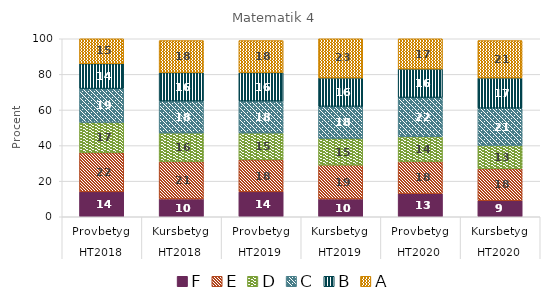
| Category | F | E | D | C | B | A |
|---|---|---|---|---|---|---|
| 0 | 14 | 22 | 17 | 19 | 14 | 15 |
| 1 | 10 | 21 | 16 | 18 | 16 | 18 |
| 2 | 14 | 18 | 15 | 18 | 16 | 18 |
| 3 | 10 | 19 | 15 | 18 | 16 | 23 |
| 4 | 13 | 18 | 14 | 22 | 16 | 17 |
| 5 | 9 | 18 | 13 | 21 | 17 | 21 |